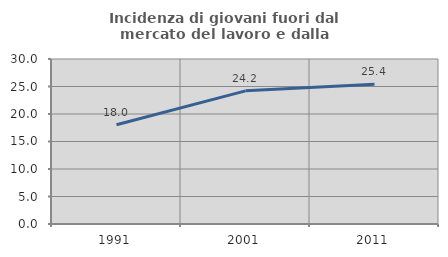
| Category | Incidenza di giovani fuori dal mercato del lavoro e dalla formazione  |
|---|---|
| 1991.0 | 18.038 |
| 2001.0 | 24.213 |
| 2011.0 | 25.401 |